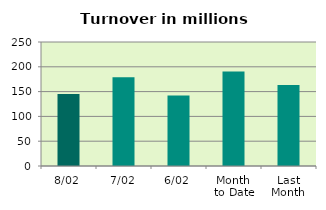
| Category | Series 0 |
|---|---|
| 8/02 | 145.189 |
| 7/02 | 178.715 |
| 6/02 | 142.259 |
| Month 
to Date | 190.727 |
| Last
Month | 163.097 |